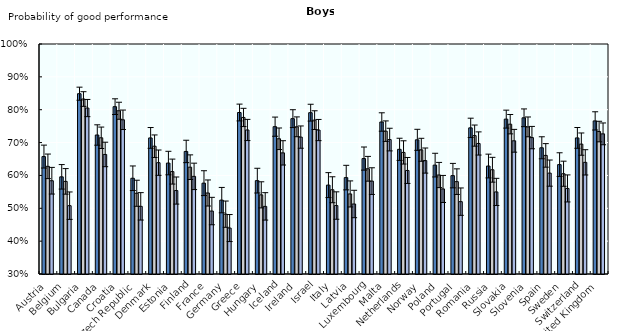
| Category | Healthy weight | Pre-obese | Obese |
|---|---|---|---|
| Austria | 0.657 | 0.628 | 0.584 |
| Belgium | 0.596 | 0.582 | 0.508 |
| Bulgaria | 0.849 | 0.833 | 0.805 |
| Canada | 0.723 | 0.715 | 0.664 |
| Croatia | 0.809 | 0.797 | 0.769 |
| Czech Republic | 0.591 | 0.546 | 0.506 |
| Denmark | 0.714 | 0.689 | 0.639 |
| Estonia | 0.638 | 0.612 | 0.554 |
| Finland | 0.673 | 0.625 | 0.597 |
| France | 0.576 | 0.547 | 0.492 |
| Germany | 0.525 | 0.482 | 0.44 |
| Greece | 0.791 | 0.776 | 0.738 |
| Hungary | 0.584 | 0.541 | 0.506 |
| Iceland | 0.748 | 0.712 | 0.669 |
| Ireland | 0.773 | 0.748 | 0.717 |
| Israel | 0.791 | 0.768 | 0.738 |
| Italy | 0.571 | 0.556 | 0.508 |
| Latvia | 0.593 | 0.544 | 0.513 |
| Luxembourg | 0.651 | 0.62 | 0.583 |
| Malta | 0.763 | 0.735 | 0.709 |
| Netherlands | 0.679 | 0.67 | 0.615 |
| Norway | 0.708 | 0.678 | 0.645 |
| Poland | 0.631 | 0.601 | 0.559 |
| Portugal | 0.599 | 0.581 | 0.52 |
| Romania | 0.745 | 0.721 | 0.697 |
| Russia | 0.629 | 0.617 | 0.55 |
| Slovakia | 0.771 | 0.756 | 0.705 |
| Slovenia | 0.775 | 0.748 | 0.715 |
| Spain | 0.684 | 0.661 | 0.607 |
| Sweden | 0.633 | 0.605 | 0.56 |
| Switzerland | 0.714 | 0.695 | 0.64 |
| United Kingdom | 0.766 | 0.734 | 0.727 |